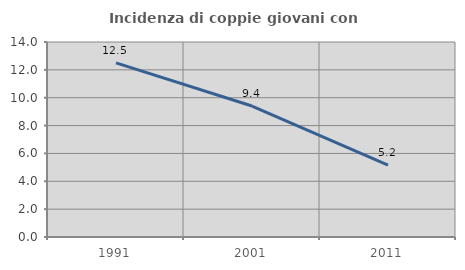
| Category | Incidenza di coppie giovani con figli |
|---|---|
| 1991.0 | 12.5 |
| 2001.0 | 9.402 |
| 2011.0 | 5.164 |